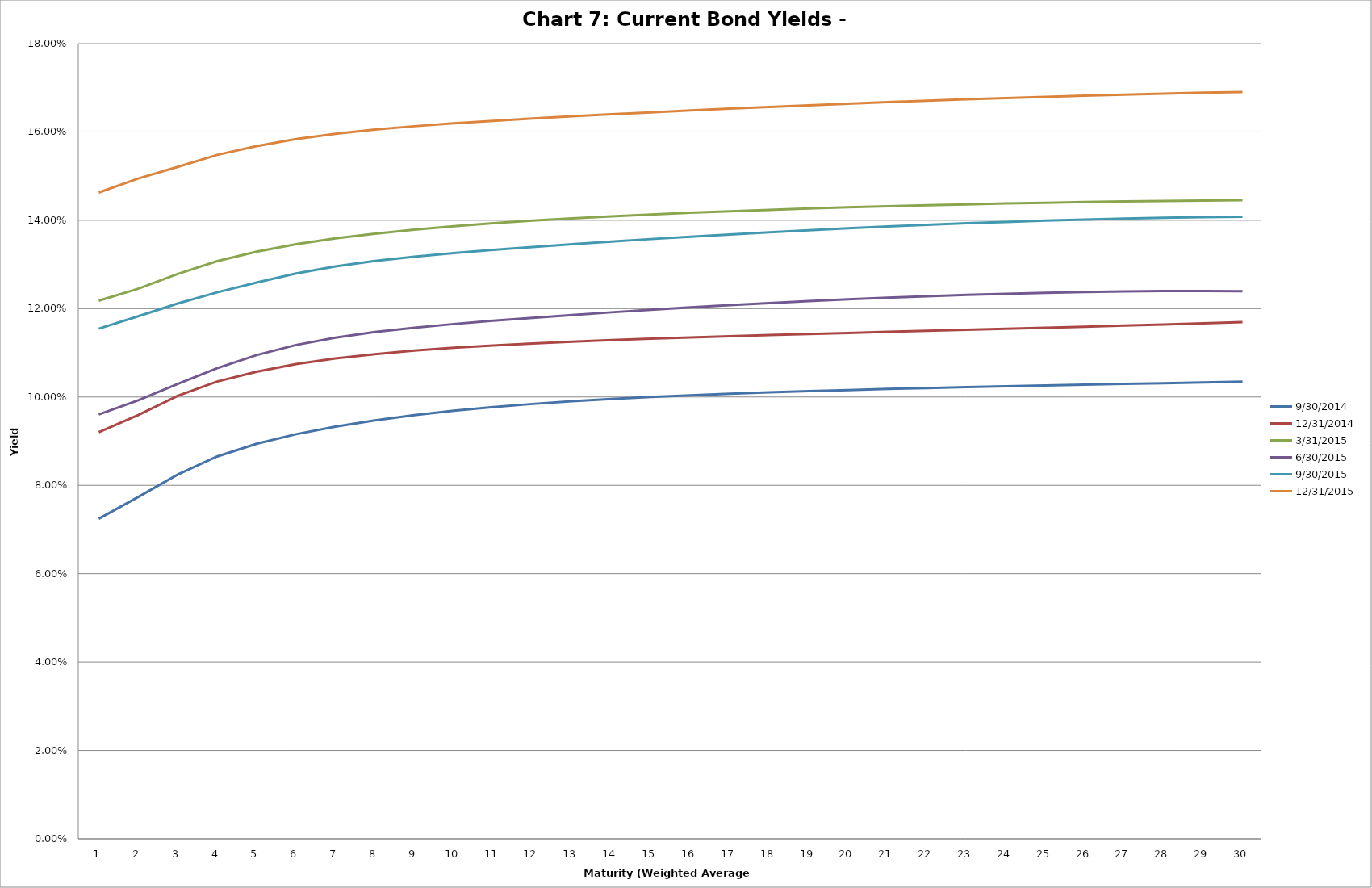
| Category | 9/30/2014 | 12/31/2014 | 3/31/2015 | 6/30/2015 | 9/30/2015 | 12/31/2015 |
|---|---|---|---|---|---|---|
| 0 | 0.072 | 0.092 | 0.122 | 0.096 | 0.115 | 0.146 |
| 1 | 0.077 | 0.096 | 0.125 | 0.099 | 0.118 | 0.149 |
| 2 | 0.082 | 0.1 | 0.128 | 0.103 | 0.121 | 0.152 |
| 3 | 0.087 | 0.104 | 0.131 | 0.107 | 0.124 | 0.155 |
| 4 | 0.089 | 0.106 | 0.133 | 0.109 | 0.126 | 0.157 |
| 5 | 0.092 | 0.107 | 0.135 | 0.112 | 0.128 | 0.158 |
| 6 | 0.093 | 0.109 | 0.136 | 0.113 | 0.13 | 0.16 |
| 7 | 0.095 | 0.11 | 0.137 | 0.115 | 0.131 | 0.161 |
| 8 | 0.096 | 0.11 | 0.138 | 0.116 | 0.132 | 0.161 |
| 9 | 0.097 | 0.111 | 0.139 | 0.117 | 0.133 | 0.162 |
| 10 | 0.098 | 0.112 | 0.139 | 0.117 | 0.133 | 0.163 |
| 11 | 0.098 | 0.112 | 0.14 | 0.118 | 0.134 | 0.163 |
| 12 | 0.099 | 0.113 | 0.14 | 0.119 | 0.135 | 0.164 |
| 13 | 0.1 | 0.113 | 0.141 | 0.119 | 0.135 | 0.164 |
| 14 | 0.1 | 0.113 | 0.141 | 0.12 | 0.136 | 0.164 |
| 15 | 0.1 | 0.113 | 0.142 | 0.12 | 0.136 | 0.165 |
| 16 | 0.101 | 0.114 | 0.142 | 0.121 | 0.137 | 0.165 |
| 17 | 0.101 | 0.114 | 0.142 | 0.121 | 0.137 | 0.166 |
| 18 | 0.101 | 0.114 | 0.143 | 0.122 | 0.138 | 0.166 |
| 19 | 0.102 | 0.115 | 0.143 | 0.122 | 0.138 | 0.166 |
| 20 | 0.102 | 0.115 | 0.143 | 0.122 | 0.139 | 0.167 |
| 21 | 0.102 | 0.115 | 0.143 | 0.123 | 0.139 | 0.167 |
| 22 | 0.102 | 0.115 | 0.144 | 0.123 | 0.139 | 0.167 |
| 23 | 0.102 | 0.115 | 0.144 | 0.123 | 0.14 | 0.168 |
| 24 | 0.103 | 0.116 | 0.144 | 0.124 | 0.14 | 0.168 |
| 25 | 0.103 | 0.116 | 0.144 | 0.124 | 0.14 | 0.168 |
| 26 | 0.103 | 0.116 | 0.144 | 0.124 | 0.14 | 0.168 |
| 27 | 0.103 | 0.116 | 0.144 | 0.124 | 0.141 | 0.169 |
| 28 | 0.103 | 0.117 | 0.144 | 0.124 | 0.141 | 0.169 |
| 29 | 0.103 | 0.117 | 0.145 | 0.124 | 0.141 | 0.169 |